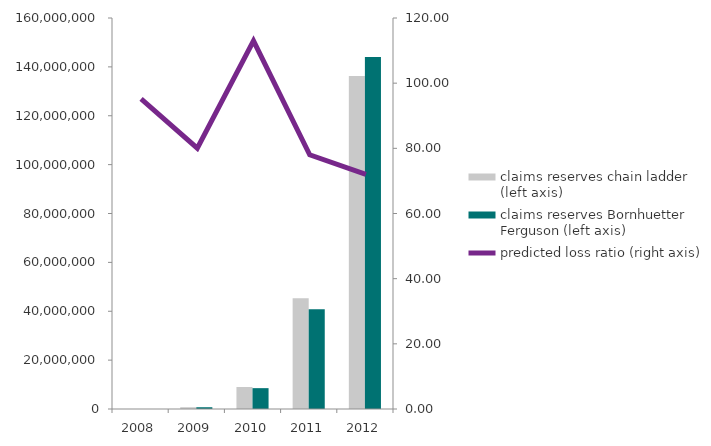
| Category | claims reserves chain ladder (left axis) | claims reserves Bornhuetter Ferguson (left axis) |
|---|---|---|
| 2008.0 | 0 | 0 |
| 2009.0 | 731637.035 | 724970.204 |
| 2010.0 | 8993401.657 | 8532036.118 |
| 2011.0 | 45300160.954 | 40795736.602 |
| 2012.0 | 136286647.604 | 144079245.64 |